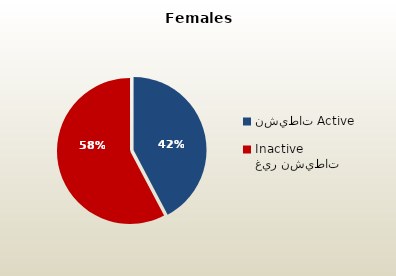
| Category | الاناث القطريات  Qatari Females |
|---|---|
| نشيطات Active | 46831 |
| غير نشيطات Inactive | 63973 |